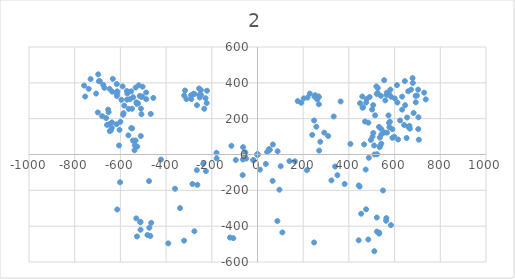
| Category | Series 0 |
|---|---|
| -114.17500000000007 | 48.528 |
| 0.0 | 0 |
| 101.52099999999996 | -65.348 |
| -422.4599999999999 | -27.985 |
| -53.29099999999994 | 12.058 |
| 139.62900000000013 | -36.916 |
| 53.88700000000006 | 25.604 |
| 67.2840000000001 | 55.971 |
| 247.70000000000005 | 189.944 |
| 257.5250000000001 | 155.111 |
| -284.61699999999996 | -164.786 |
| -263.1809999999999 | -169.251 |
| -64.90199999999993 | -114.769 |
| 532.4660000000001 | -441.513 |
| -321.385 | -480.961 |
| -469.05299999999994 | -454.762 |
| 323.61800000000017 | -144.392 |
| 247.84900000000016 | -491.083 |
| -549.2869999999999 | 255.144 |
| -583.2269999999999 | 273.007 |
| -595.731 | 305.16 |
| -543.9279999999999 | 319.45 |
| -522.4929999999999 | 285.511 |
| -508.20199999999994 | 321.237 |
| -590.372 | 380.185 |
| -502.84299999999996 | 378.398 |
| -467.11699999999996 | 226.563 |
| -275.98299999999995 | 337.313 |
| -222.3939999999999 | 287.297 |
| -233.11199999999997 | 255.144 |
| 175.95100000000002 | 298.015 |
| 218.82200000000012 | 317.664 |
| 470.54100000000017 | 183.989 |
| 514.6030000000001 | 218.525 |
| 501.50400000000013 | 250.678 |
| 462.20500000000015 | 263.777 |
| 506.26700000000005 | 275.686 |
| 490.78600000000006 | 320.939 |
| 526.512 | 370.955 |
| 565.8110000000001 | 344.756 |
| 612.2540000000001 | 289.977 |
| 487.21299999999997 | -18.458 |
| 36.61900000000003 | -52.696 |
| 0.0 | 0 |
| 216.14199999999994 | -87.529 |
| -237.57799999999997 | -51.803 |
| 473.37 | -84.105 |
| 381.3749999999999 | -164.488 |
| 87.97500000000002 | 18.012 |
| -225.81799999999998 | -92.739 |
| -265.414 | -87.38 |
| 406.53200000000004 | 58.948 |
| 475.30499999999995 | -305.904 |
| 522.939 | -430.349 |
| 484.832 | -474.411 |
| -512.221 | -375.421 |
| -120.42600000000004 | -463.545 |
| -106.13599999999997 | -467.117 |
| -18.60699999999997 | -30.367 |
| 10.866999999999962 | -84.403 |
| 66.24199999999996 | -147.37 |
| -564.917 | 106.88 |
| -641.133 | 135.461 |
| -637.56 | 148.561 |
| -662.568 | 203.341 |
| -586.3530000000001 | 230.73 |
| -563.726 | 254.548 |
| -507.75600000000003 | 224.776 |
| -510.137 | 255.739 |
| -569.681 | 340.29 |
| -614.934 | 337.908 |
| -647.087 | 366.489 |
| -754.265 | 323.618 |
| -738.784 | 366.489 |
| -730.448 | 421.269 |
| -689.9580000000001 | 409.36 |
| -697.104 | 447.468 |
| -317.217 | 356.962 |
| -320.7900000000001 | 329.572 |
| -311.26300000000003 | 309.328 |
| -289.827 | 309.328 |
| -254.101 | 333.145 |
| 266.3079999999999 | 324.511 |
| 268.68899999999996 | 280.449 |
| 559.2610000000001 | 301.885 |
| 600.9409999999999 | 312.603 |
| 692.638 | 291.167 |
| 536.6339999999999 | 48.23 |
| 598.5590000000001 | 99.437 |
| 660.485 | 154.217 |
| 590.2230000000001 | 141.118 |
| 683.259 | 231.623 |
| 0.0 | 0 |
| 50.462999999999965 | 30.367 |
| -179.524 | 9.378 |
| -360.98199999999997 | -191.134 |
| -338.9509999999999 | -299.205 |
| -481.706 | -449.106 |
| 333.442 | 212.272 |
| 239.66200000000003 | 109.56 |
| 339.69399999999996 | -67.284 |
| 446.87200000000007 | -178.928 |
| 87.08200000000011 | -371.104 |
| 511.328 | -539.612 |
| -49.12399999999991 | -22.478 |
| -17.416999999999916 | -33.196 |
| 292.20900000000006 | 121.915 |
| -538.2719999999999 | 23.371 |
| -537.0809999999999 | 51.951 |
| -533.509 | 78.15 |
| -510.88199999999995 | 103.159 |
| -552.563 | 147.221 |
| -603.77 | 137.694 |
| -646.641 | 130.549 |
| -616.8689999999999 | 168.656 |
| -658.55 | 165.084 |
| -679.9849999999999 | 213.909 |
| -706.184 | 340.141 |
| -694.276 | 409.211 |
| -571.616 | 354.432 |
| -533.509 | 373.485 |
| -487.06499999999994 | 346.095 |
| -279.8539999999999 | 338.95 |
| -227.45600000000002 | 313.942 |
| 523.386 | 1.34 |
| 495.9960000000001 | 81.128 |
| 535.2940000000001 | 94.227 |
| 506.71299999999997 | 120.426 |
| 555.539 | 122.808 |
| 531.722 | 153.77 |
| 485.278 | 177.588 |
| 575.7840000000001 | 176.397 |
| 573.402 | 218.077 |
| 525.767 | 343.118 |
| 632.9449999999999 | 250.231 |
| 646.0450000000001 | 275.239 |
| 584.1200000000001 | 322.874 |
| 574.5930000000001 | 340.737 |
| 581.738 | 362.172 |
| 632.9449999999999 | 322.874 |
| 610.319 | 387.18 |
| 672.2440000000001 | 362.172 |
| 703.2060000000001 | 362.172 |
| 644.854 | 409.807 |
| 249.4860000000001 | 322.874 |
| 261.395 | 307.392 |
| 0.0 | 0 |
| 309.25299999999993 | 103.233 |
| 274.7180000000001 | 71.08 |
| 269.9549999999999 | 21.659 |
| 562.6099999999999 | -369.839 |
| 584.046 | -393.954 |
| 442.9279999999999 | -478.803 |
| 453.64599999999996 | -330.54 |
| -511.84900000000005 | -419.855 |
| -527.331 | -457.367 |
| -390.3810000000001 | -496.071 |
| 108.88999999999987 | -434.741 |
| 549.213 | -200.736 |
| -55.450000000000045 | 0 |
| -601.462 | -154.887 |
| -637.188 | 179.151 |
| -651.4780000000001 | 236.313 |
| -674.7 | 388.148 |
| -615.7520000000001 | 393.507 |
| -613.966 | 352.422 |
| -553.2320000000001 | 352.422 |
| -571.095 | 305.978 |
| -528.224 | 282.756 |
| -505.00200000000007 | 323.841 |
| -758.6560000000001 | 384.575 |
| -290.6460000000001 | 330.986 |
| -247.7750000000001 | 359.567 |
| -253.13300000000004 | 318.482 |
| -220.98000000000002 | 355.995 |
| 252.3889999999999 | 330.986 |
| 268.4659999999999 | 320.269 |
| 448.88200000000006 | 286.329 |
| 459.5999999999999 | 261.321 |
| 475.6769999999999 | 289.902 |
| 539.9839999999999 | 327.414 |
| 564.992 | 332.773 |
| 691.819 | 327.414 |
| 736.4769999999999 | 307.765 |
| 729.3319999999999 | 345.277 |
| 704.3229999999999 | 207.732 |
| 623.94 | 189.869 |
| 579.2819999999999 | 182.724 |
| 541.77 | 141.639 |
| 541.77 | 111.272 |
| 566.778 | 121.989 |
| 665.0249999999999 | 159.502 |
| 0.0 | 0 |
| -613.817 | -306.872 |
| -473.59299999999996 | -408.691 |
| -512.891 | -378.324 |
| -276.207 | -428.34 |
| -63.18999999999994 | 41.01 |
| 42.20100000000002 | 14.216 |
| 163.67000000000007 | -38.034 |
| 363.884 | 296.004 |
| 563.8010000000002 | -355.251 |
| 532.5409999999999 | -436.527 |
| 522.1210000000001 | -351.827 |
| 442.9280000000001 | -172.602 |
| 349.59400000000005 | -115.44 |
| 95.93900000000008 | -196.419 |
| -95.04599999999994 | -30.591 |
| -63.785999999999945 | -27.911 |
| -179.00199999999995 | -21.659 |
| -474.63499999999993 | -148.487 |
| -530.4569999999999 | -356.59 |
| -465.25699999999995 | -381.599 |
| -605.9279999999999 | 50.388 |
| -526.1399999999999 | 44.434 |
| -545.194 | 77.778 |
| -548.766 | 145.658 |
| -599.9739999999999 | 182.574 |
| -648.799 | 169.475 |
| -698.816 | 234.973 |
| -588.0649999999999 | 221.873 |
| -653.5629999999999 | 250.454 |
| -615.4549999999999 | 326.669 |
| -635.6999999999999 | 350.487 |
| -670.2349999999999 | 371.922 |
| -633.318 | 421.939 |
| -558.2929999999999 | 308.806 |
| -529.712 | 290.943 |
| -486.84099999999995 | 308.806 |
| -515.422 | 326.669 |
| -520.1859999999999 | 386.213 |
| -455.87899999999996 | 315.951 |
| -247.47699999999998 | 332.624 |
| -255.813 | 368.35 |
| -264.8929999999999 | 275.462 |
| 191.50600000000009 | 288.859 |
| 202.22400000000016 | 312.974 |
| 229.01800000000003 | 339.769 |
| 458.558 | 323.692 |
| 477.3140000000001 | 309.402 |
| 521.972 | 337.983 |
| 520.185 | 379.961 |
| 554.125 | 414.793 |
| 678.5710000000001 | 426.702 |
| 679.762 | 399.312 |
| 697.625 | 329.051 |
| 659.517 | 352.868 |
| 654.7530000000002 | 206.392 |
| 703.579 | 142.085 |
| 705.961 | 82.542 |
| 652.3720000000001 | 92.069 |
| 666.662 | 144.467 |
| 641.654 | 164.711 |
| 577.347 | 152.803 |
| 590.4470000000001 | 93.259 |
| 615.4550000000002 | 83.732 |
| 503.51300000000015 | 100.405 |
| 510.65800000000013 | 50.388 |
| 541.6210000000001 | 59.915 |
| 534.4760000000001 | 40.861 |
| 511.84900000000016 | 0.372 |
| 466.596 | 56.343 |